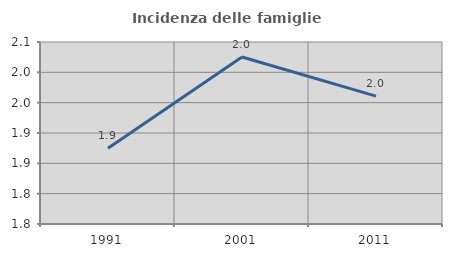
| Category | Incidenza delle famiglie numerose |
|---|---|
| 1991.0 | 1.875 |
| 2001.0 | 2.025 |
| 2011.0 | 1.961 |